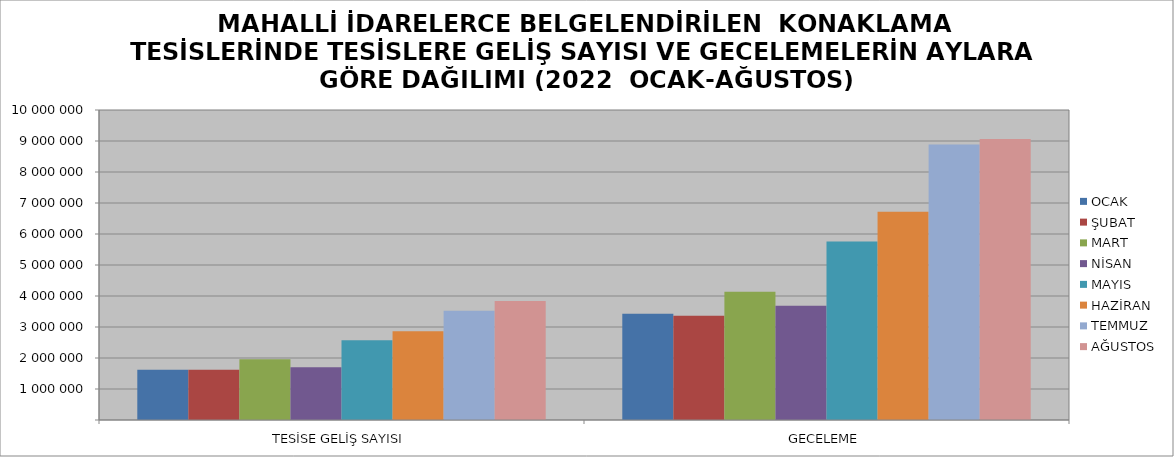
| Category | OCAK | ŞUBAT | MART | NİSAN | MAYIS | HAZİRAN | TEMMUZ | AĞUSTOS |
|---|---|---|---|---|---|---|---|---|
| TESİSE GELİŞ SAYISI | 1617436 | 1619305 | 1960867 | 1699422 | 2574819 | 2859746 | 3526528 | 3842457 |
| GECELEME | 3427709 | 3362025 | 4136510 | 3684991 | 5758959 | 6716122 | 8890725 | 9063514 |